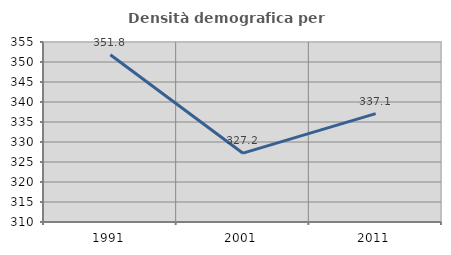
| Category | Densità demografica |
|---|---|
| 1991.0 | 351.814 |
| 2001.0 | 327.204 |
| 2011.0 | 337.083 |